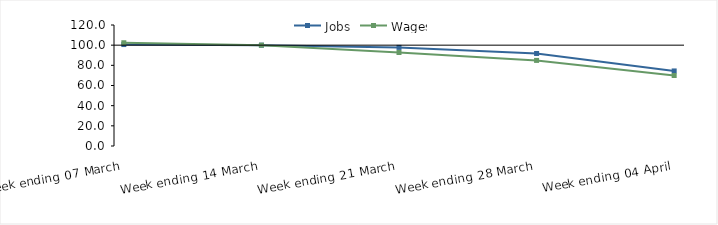
| Category | Jobs | Wages |
|---|---|---|
| 0 | 100.606 | 102.4 |
| 1900-01-01 | 100 | 100 |
| 1900-01-02 | 97.789 | 92.715 |
| 1900-01-03 | 91.766 | 84.887 |
| 1900-01-04 | 74.435 | 69.888 |